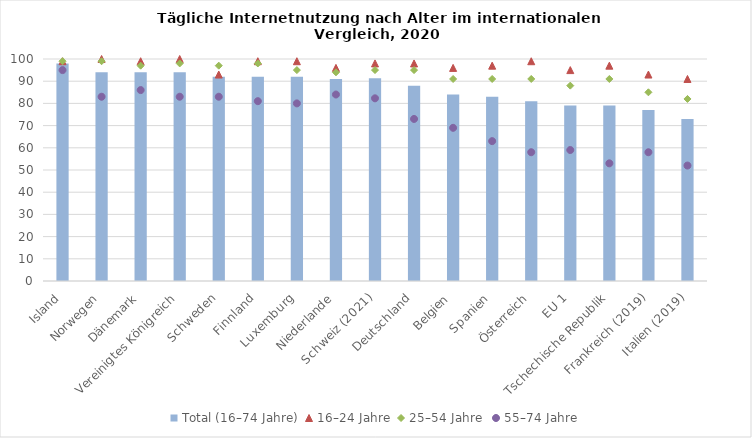
| Category | Total (16–74 Jahre) |
|---|---|
| Island | 98 |
| Norwegen | 94 |
| Dänemark | 94 |
| Vereinigtes Königreich | 94 |
| Schweden | 92 |
| Finnland | 92 |
| Luxemburg | 92 |
| Niederlande | 91 |
| Schweiz (2021) | 91.347 |
| Deutschland | 88 |
| Belgien | 84 |
| Spanien | 83 |
| Österreich | 81 |
| EU 1 | 79 |
| Tschechische Republik | 79 |
| Frankreich (2019) | 77 |
| Italien (2019) | 73 |